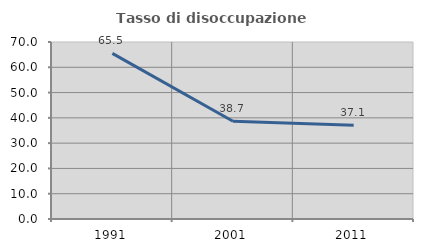
| Category | Tasso di disoccupazione giovanile  |
|---|---|
| 1991.0 | 65.49 |
| 2001.0 | 38.667 |
| 2011.0 | 37.079 |